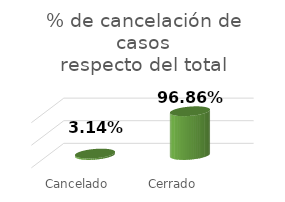
| Category | Total |
|---|---|
| Cancelado | 0.031 |
| Cerrado | 0.969 |